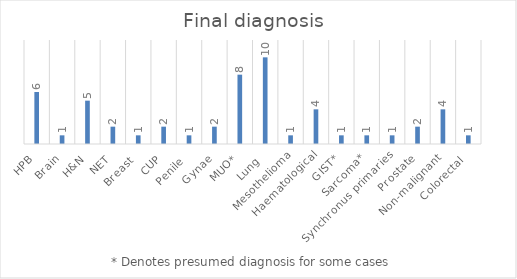
| Category | Series 0 |
|---|---|
| HPB | 6 |
| Brain | 1 |
| H&N | 5 |
| NET | 2 |
| Breast  | 1 |
| CUP | 2 |
| Penile  | 1 |
| Gynae | 2 |
| MUO* | 8 |
| Lung  | 10 |
| Mesothelioma | 1 |
| Haematological | 4 |
| GIST* | 1 |
| Sarcoma* | 1 |
| Synchronus primaries | 1 |
| Prostate | 2 |
| Non-malignant | 4 |
| Colorectal  | 1 |